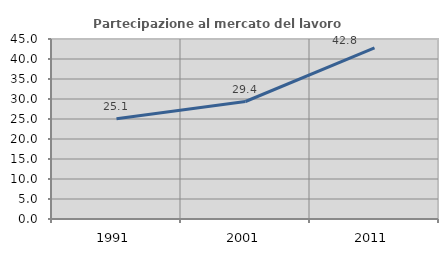
| Category | Partecipazione al mercato del lavoro  femminile |
|---|---|
| 1991.0 | 25.061 |
| 2001.0 | 29.374 |
| 2011.0 | 42.798 |